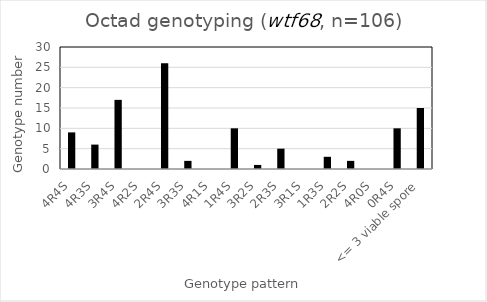
| Category | Number |
|---|---|
| 4R4S | 9 |
| 4R3S | 6 |
| 3R4S | 17 |
| 4R2S | 0 |
| 2R4S | 26 |
| 3R3S | 2 |
| 4R1S | 0 |
| 1R4S | 10 |
| 3R2S | 1 |
| 2R3S | 5 |
| 3R1S | 0 |
| 1R3S | 3 |
| 2R2S | 2 |
| 4R0S | 0 |
| 0R4S | 10 |
| <= 3 viable spore | 15 |